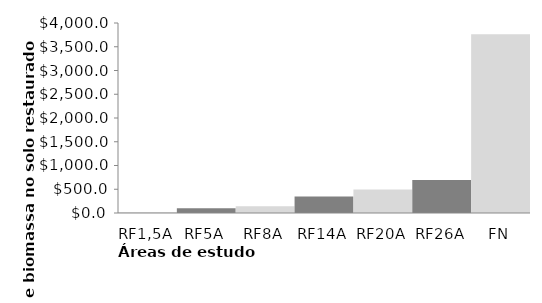
| Category | Series 0 |
|---|---|
| RF1,5A | 13.668 |
| RF5A | 98.49 |
| RF8A | 141.172 |
| RF14A | 349.515 |
| RF20A | 493.977 |
| RF26A | 694.998 |
| FN | 3762.073 |